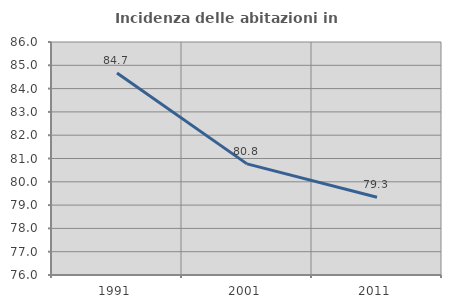
| Category | Incidenza delle abitazioni in proprietà  |
|---|---|
| 1991.0 | 84.672 |
| 2001.0 | 80.769 |
| 2011.0 | 79.339 |